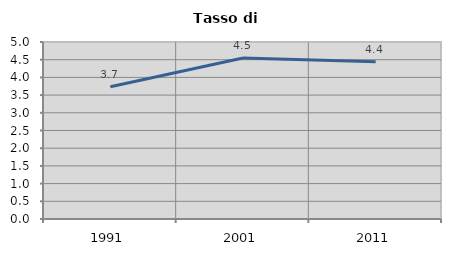
| Category | Tasso di disoccupazione   |
|---|---|
| 1991.0 | 3.738 |
| 2001.0 | 4.545 |
| 2011.0 | 4.444 |